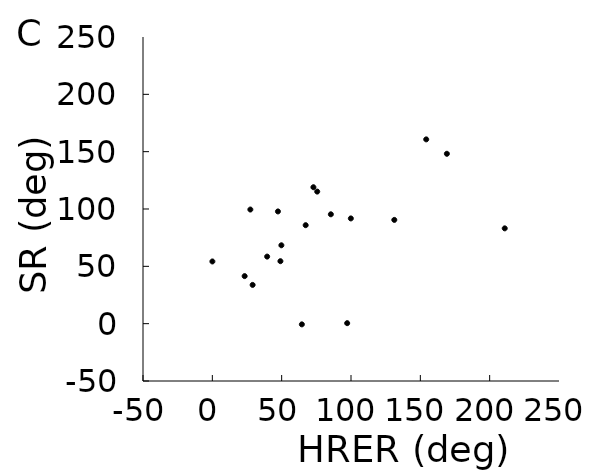
| Category | Series 0 |
|---|---|
| 23.305386337225016 | 41.469 |
| 49.79023553390322 | 68.362 |
| 0.03868867905482598 | 54.253 |
| 29.057469437645118 | 33.796 |
| 210.86592340191535 | 83.123 |
| 64.55903235468662 | -0.607 |
| 67.31566085162837 | 85.885 |
| 97.24016008156747 | 0.442 |
| 39.525170343754056 | 58.489 |
| 75.63999122304722 | 115.182 |
| 154.243531352296 | 160.727 |
| 131.23041708356894 | 90.494 |
| 99.87669784077607 | 91.779 |
| 72.89388357101652 | 118.983 |
| 169.13855533109813 | 148.155 |
| 27.417615798668646 | 99.533 |
| 47.31271418800432 | 97.879 |
| 49.10072759352905 | 54.491 |
| 85.47085915785192 | 95.383 |